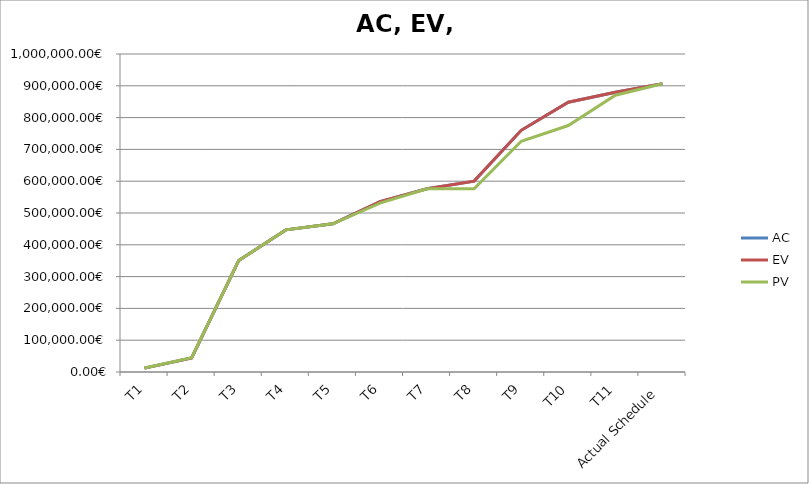
| Category | AC | EV | PV |
|---|---|---|---|
| T1 | 12275.34 | 12275.34 | 12835.34 |
| T2 | 44220.279 | 44220.279 | 44780.279 |
| T3 | 350574.58 | 350574.58 | 350574.58 |
| T4 | 446927.987 | 446927.987 | 446927.987 |
| T5 | 466178.977 | 466178.977 | 466178.977 |
| T6 | 535620.848 | 535620.848 | 530979.408 |
| T7 | 576101.138 | 576101.138 | 576101.138 |
| T8 | 600191.798 | 600191.798 | 576101.138 |
| T9 | 759971.426 | 759971.426 | 725651.535 |
| T10 | 848533.867 | 848533.867 | 775091.426 |
| T11 | 879733.867 | 879733.866 | 870373.867 |
| Actual Schedule | 906253.867 | 906253.867 | 906253.867 |